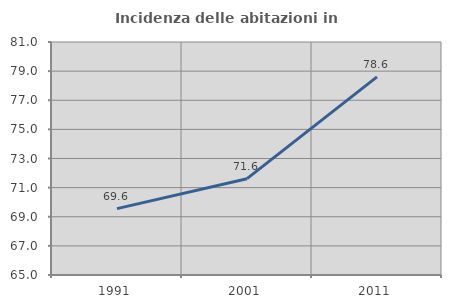
| Category | Incidenza delle abitazioni in proprietà  |
|---|---|
| 1991.0 | 69.557 |
| 2001.0 | 71.613 |
| 2011.0 | 78.601 |